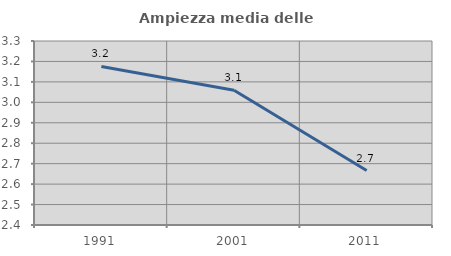
| Category | Ampiezza media delle famiglie |
|---|---|
| 1991.0 | 3.176 |
| 2001.0 | 3.059 |
| 2011.0 | 2.666 |